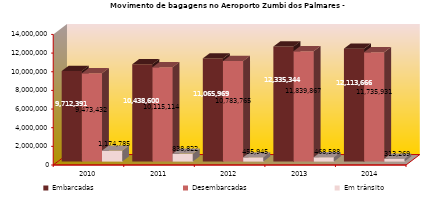
| Category | Embarcadas | Desembarcadas | Em trânsito |
|---|---|---|---|
| 2010.0 | 9712391 | 9473432 | 1174785 |
| 2011.0 | 10438600 | 10115114 | 838822 |
| 2012.0 | 11065969 | 10783765 | 455945 |
| 2013.0 | 12335344 | 11839867 | 468588 |
| 2014.0 | 12113666 | 11735931 | 313269 |